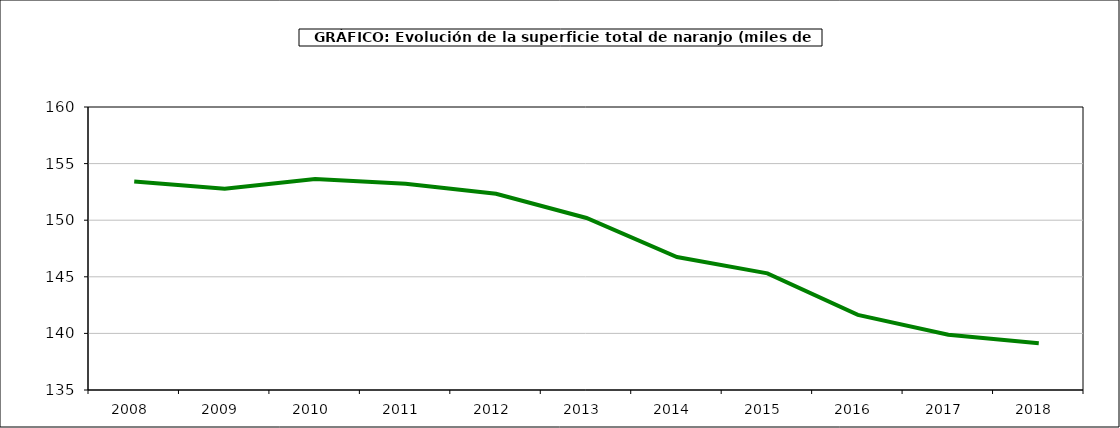
| Category | superficie |
|---|---|
| 2008.0 | 153.42 |
| 2009.0 | 152.776 |
| 2010.0 | 153.631 |
| 2011.0 | 153.222 |
| 2012.0 | 152.34 |
| 2013.0 | 150.198 |
| 2014.0 | 146.742 |
| 2015.0 | 145.306 |
| 2016.0 | 141.639 |
| 2017.0 | 139.878 |
| 2018.0 | 139.132 |